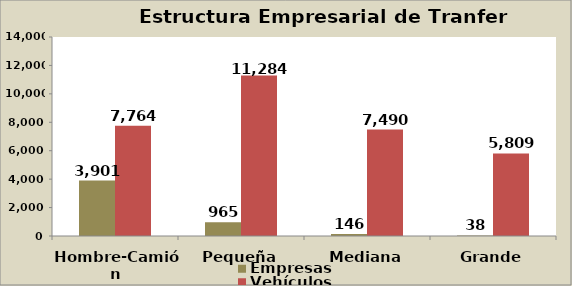
| Category | Empresas | Vehículos |
|---|---|---|
| Hombre-Camión | 3901 | 7764 |
| Pequeña | 965 | 11284 |
| Mediana | 146 | 7490 |
| Grande | 38 | 5809 |